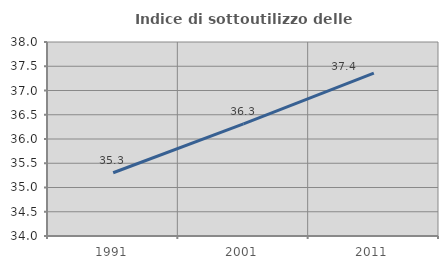
| Category | Indice di sottoutilizzo delle abitazioni  |
|---|---|
| 1991.0 | 35.304 |
| 2001.0 | 36.312 |
| 2011.0 | 37.36 |